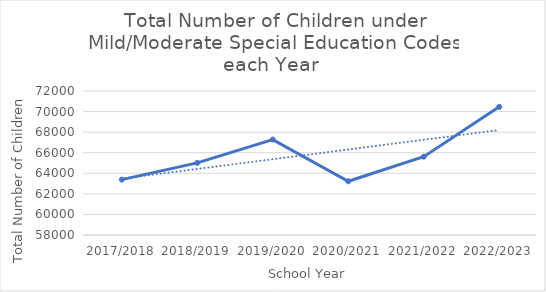
| Category | Series 0 |
|---|---|
| 2017/2018 | 63386 |
| 2018/2019 | 65015 |
| 2019/2020 | 67278 |
| 2020/2021 | 63223 |
| 2021/2022 | 65614 |
| 2022/2023 | 70458 |